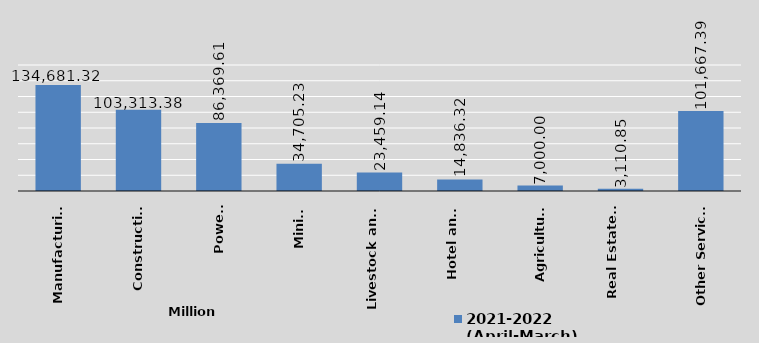
| Category | 2021-2022
(April-March)
 |
|---|---|
| Manufacturing | 134681.32 |
| Construction | 103313.38 |
| Power  | 86369.61 |
| Mining | 34705.23 |
| Livestock and 
Fisheries | 23459.14 |
| Hotel and 
Tourism | 14836.32 |
| Agriculture | 7000 |
| Real Estate 
Development | 3110.85 |
| Other Services | 101667.39 |